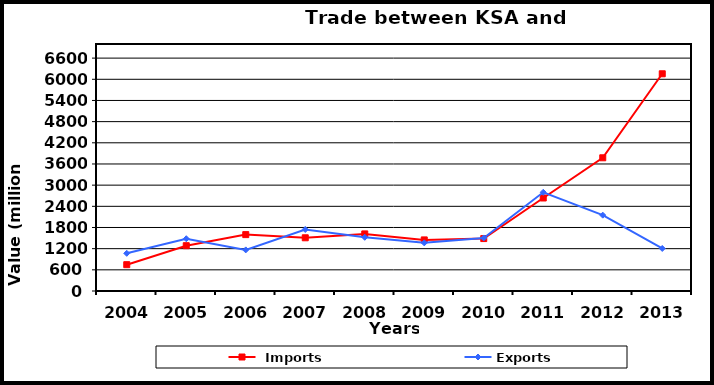
| Category |  Imports | Exports |
|---|---|---|
| 2004.0 | 746 | 1068 |
| 2005.0 | 1284 | 1481 |
| 2006.0 | 1598 | 1165 |
| 2007.0 | 1508 | 1743 |
| 2008.0 | 1618 | 1522 |
| 2009.0 | 1448 | 1364 |
| 2010.0 | 1486 | 1503 |
| 2011.0 | 2636 | 2798 |
| 2012.0 | 3775 | 2149 |
| 2013.0 | 6156 | 1205 |